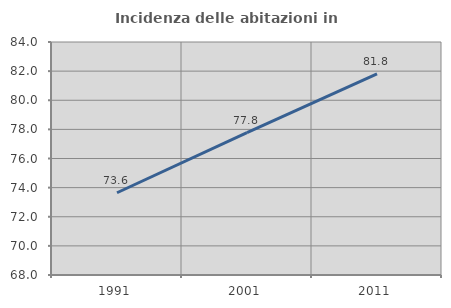
| Category | Incidenza delle abitazioni in proprietà  |
|---|---|
| 1991.0 | 73.649 |
| 2001.0 | 77.778 |
| 2011.0 | 81.818 |